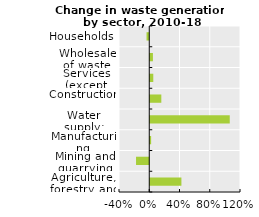
| Category | Change 2010-2018 |
|---|---|
| Agriculture, forestry and fishing | 0.425 |
| Mining and quarrying | -0.175 |
| Manufacturing | 0.025 |
| Water supply; sewerage, waste management and remediation activities | 1.065 |
| Construction | 0.16 |
| Services (except wholesale of waste and scrap) | 0.053 |
| Wholesale of waste and scrap | 0.048 |
| Households | -0.036 |